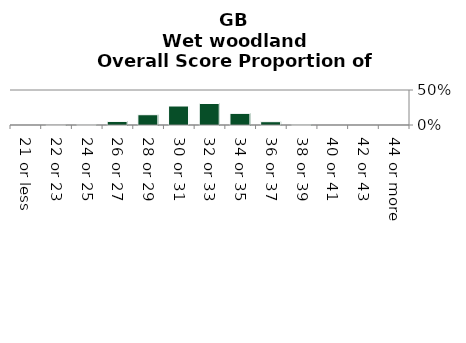
| Category | Wet woodland |
|---|---|
| 21 or less | 0 |
| 22 or 23 | 0 |
| 24 or 25 | 0.006 |
| 26 or 27 | 0.051 |
| 28 or 29 | 0.147 |
| 30 or 31 | 0.271 |
| 32 or 33 | 0.307 |
| 34 or 35 | 0.166 |
| 36 or 37 | 0.047 |
| 38 or 39 | 0.005 |
| 40 or 41 | 0 |
| 42 or 43 | 0 |
| 44 or more | 0 |